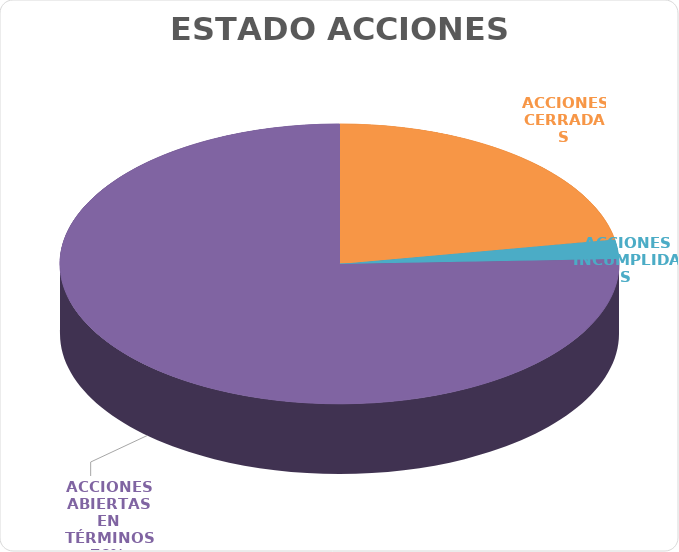
| Category | Series 0 |
|---|---|
| ACCIONES CERRADAS | 10 |
| ACCIONES INCUMPLIDAS | 1 |
| ACCIONES ABIERTAS EN TÉRMINOS | 34 |